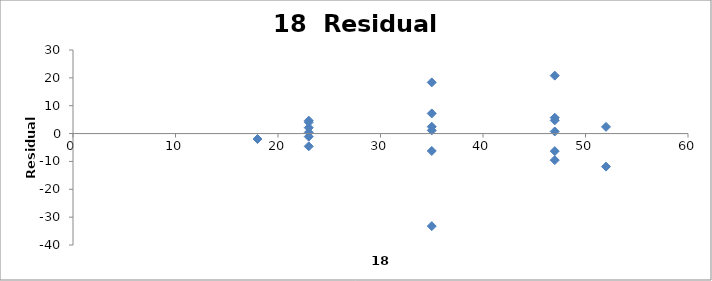
| Category | Series 0 |
|---|---|
| 35.0 | 2.458 |
| 52.0 | 2.411 |
| 52.0 | -11.854 |
| 18.0 | -1.95 |
| 35.0 | -6.243 |
| 35.0 | 1.138 |
| 35.0 | -33.233 |
| 23.0 | 4.068 |
| 23.0 | 0.394 |
| 47.0 | 0.749 |
| 47.0 | -6.305 |
| 47.0 | -9.536 |
| 23.0 | 4.636 |
| 23.0 | -1.102 |
| 23.0 | 2.113 |
| 23.0 | -4.571 |
| 47.0 | 5.703 |
| 47.0 | 4.746 |
| 47.0 | 20.797 |
| 35.0 | 18.365 |
| 35.0 | 7.221 |